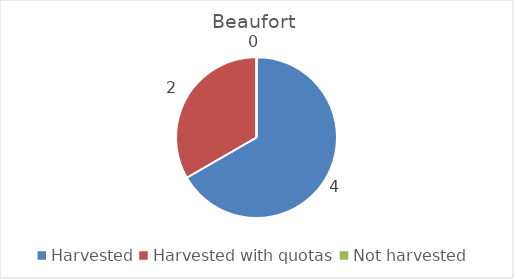
| Category | Beaufort |
|---|---|
| Harvested | 4 |
| Harvested with quotas | 2 |
| Not harvested | 0 |